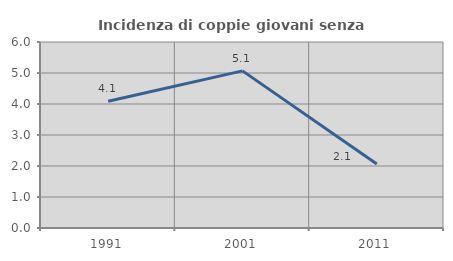
| Category | Incidenza di coppie giovani senza figli |
|---|---|
| 1991.0 | 4.09 |
| 2001.0 | 5.068 |
| 2011.0 | 2.068 |